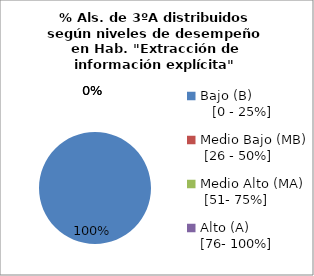
| Category | Series 0 |
|---|---|
| Bajo (B)                 [0 - 25%] | 1 |
| Medio Bajo (MB)  [26 - 50%] | 0 |
| Medio Alto (MA)   [51- 75%] | 0 |
| Alto (A)               [76- 100%] | 0 |